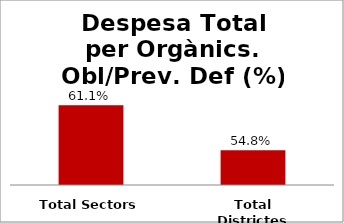
| Category | Series 0 |
|---|---|
| Total Sectors | 0.611 |
| Total Districtes | 0.548 |